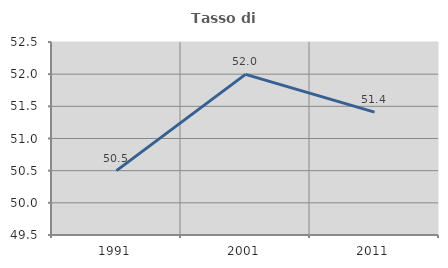
| Category | Tasso di occupazione   |
|---|---|
| 1991.0 | 50.501 |
| 2001.0 | 51.996 |
| 2011.0 | 51.409 |